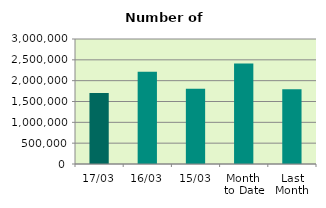
| Category | Series 0 |
|---|---|
| 17/03 | 1706456 |
| 16/03 | 2212964 |
| 15/03 | 1805748 |
| Month 
to Date | 2413739.077 |
| Last
Month | 1795830.8 |